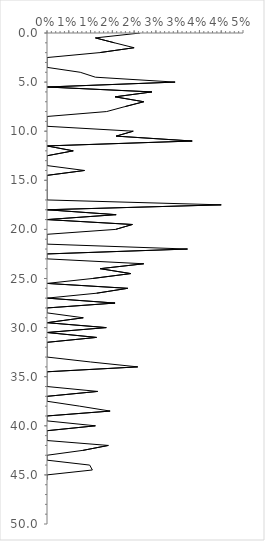
| Category | Series 0 |
|---|---|
| 0.0213903743315508 | 0 |
| 0.011111111111111112 | 0.5 |
| 0.015503875968992248 | 1 |
| 0.02 | 1.5 |
| 0.012048192771084338 | 2 |
| 0.0 | 2.5 |
| 0.0 | 3 |
| 0.0 | 3.5 |
| 0.007633587786259542 | 4 |
| 0.011111111111111112 | 4.5 |
| 0.029411764705882353 | 5 |
| 0.0 | 5.5 |
| 0.024096385542168676 | 6 |
| 0.015625 | 6.5 |
| 0.022222222222222223 | 7 |
| 0.017857142857142856 | 7.5 |
| 0.0136986301369863 | 8 |
| 0.0 | 8.5 |
| 0.0 | 9 |
| 0.0 | 9.5 |
| 0.019801980198019802 | 10 |
| 0.015873015873015872 | 10.5 |
| 0.03333333333333333 | 11 |
| 0.0 | 11.5 |
| 0.006024096385542169 | 12 |
| 0.0 | 12.5 |
| 0.0 | 13 |
| 0.0 | 13.5 |
| 0.008620689655172414 | 14 |
| 0.0 | 14.5 |
| 0.0 | 15 |
| 0.0 | 15.5 |
| 0.0 | 16 |
| 0.0 | 16.5 |
| 0.0 | 17 |
| 0.04 | 17.5 |
| 0.0 | 18 |
| 0.015873015873015872 | 18.5 |
| 0.0 | 19 |
| 0.0196078431372549 | 19.5 |
| 0.015748031496062992 | 20 |
| 0.0 | 20.5 |
| 0.0 | 21 |
| 0.0 | 21.5 |
| 0.03225806451612903 | 22 |
| 0.0 | 22.5 |
| 0.0 | 23 |
| 0.022222222222222223 | 23.5 |
| 0.012195121951219513 | 24 |
| 0.019230769230769232 | 24.5 |
| 0.010416666666666666 | 25 |
| 0.0 | 25.5 |
| 0.018518518518518517 | 26 |
| 0.011363636363636364 | 26.5 |
| 0.0 | 27 |
| 0.015625 | 27.5 |
| 0.0 | 28 |
| 0.0 | 28.5 |
| 0.008333333333333333 | 29 |
| 0.0 | 29.5 |
| 0.013605442176870748 | 30 |
| 0.0 | 30.5 |
| 0.011363636363636364 | 31 |
| 0.0 | 31.5 |
| 0.0 | 32 |
| 0.0 | 32.5 |
| 0.0 | 33 |
| 0.01 | 33.5 |
| 0.020833333333333332 | 34 |
| 0.0 | 34.5 |
| 0.0 | 35 |
| 0.0 | 35.5 |
| 0.0 | 36 |
| 0.011627906976744186 | 36.5 |
| 0.0 | 37 |
| 0.0 | 37.5 |
| 0.007518796992481203 | 38 |
| 0.014492753623188406 | 38.5 |
| 0.0 | 39 |
| 0.0 | 39.5 |
| 0.011111111111111112 | 40 |
| 0.0 | 40.5 |
| 0.0 | 41 |
| 0.0 | 41.5 |
| 0.014084507042253521 | 42 |
| 0.008264462809917356 | 42.5 |
| 0.0 | 43 |
| 0.0 | 43.5 |
| 0.00980392156862745 | 44 |
| 0.010416666666666666 | 44.5 |
| 0.0 | 45 |
| 0.0 | 45.5 |